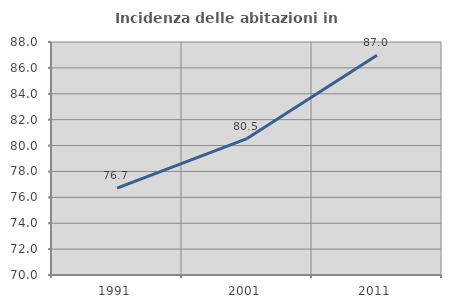
| Category | Incidenza delle abitazioni in proprietà  |
|---|---|
| 1991.0 | 76.705 |
| 2001.0 | 80.541 |
| 2011.0 | 86.977 |